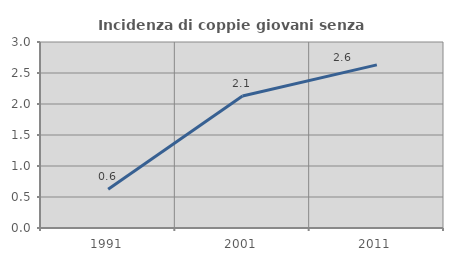
| Category | Incidenza di coppie giovani senza figli |
|---|---|
| 1991.0 | 0.625 |
| 2001.0 | 2.128 |
| 2011.0 | 2.632 |